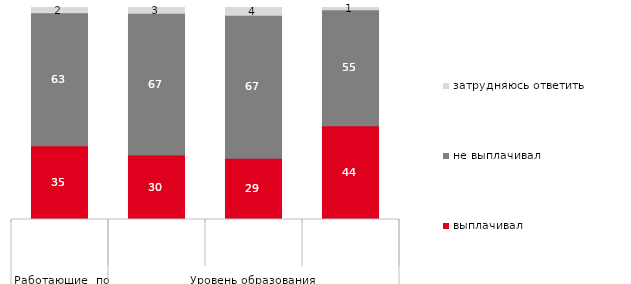
| Category | выплачивал | не выплачивал | затрудняюсь ответить |
|---|---|---|---|
| 0 | 34.766 | 62.751 | 2.483 |
| 1 | 30.45 | 66.782 | 2.768 |
| 2 | 28.906 | 67.448 | 3.646 |
| 3 | 44.236 | 54.692 | 1.072 |